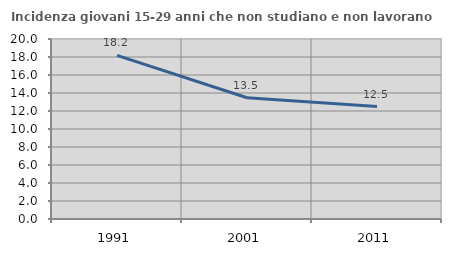
| Category | Incidenza giovani 15-29 anni che non studiano e non lavorano  |
|---|---|
| 1991.0 | 18.182 |
| 2001.0 | 13.469 |
| 2011.0 | 12.5 |